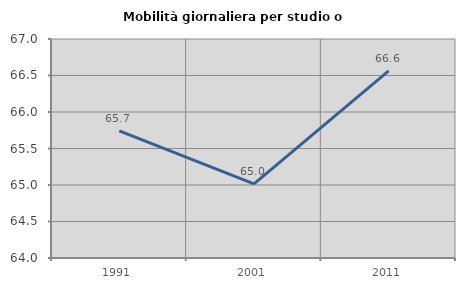
| Category | Mobilità giornaliera per studio o lavoro |
|---|---|
| 1991.0 | 65.741 |
| 2001.0 | 65.015 |
| 2011.0 | 66.563 |